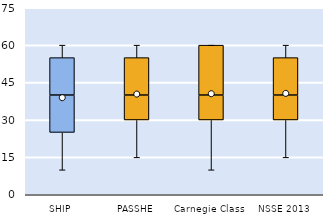
| Category | 25th | 50th | 75th |
|---|---|---|---|
| SHIP | 25 | 15 | 15 |
| PASSHE | 30 | 10 | 15 |
| Carnegie Class | 30 | 10 | 20 |
| NSSE 2013 | 30 | 10 | 15 |